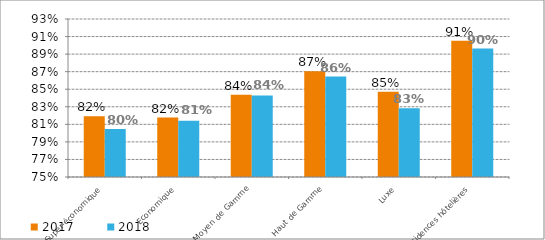
| Category | 2017 | 2018 |
|---|---|---|
| Super-économique | 0.819 | 0.805 |
| Economique | 0.818 | 0.814 |
| Moyen de Gamme | 0.844 | 0.843 |
| Haut de Gamme | 0.87 | 0.864 |
| Luxe | 0.847 | 0.828 |
| Résidences hôtelières | 0.905 | 0.896 |